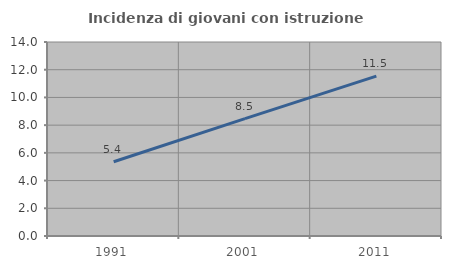
| Category | Incidenza di giovani con istruzione universitaria |
|---|---|
| 1991.0 | 5.357 |
| 2001.0 | 8.475 |
| 2011.0 | 11.538 |